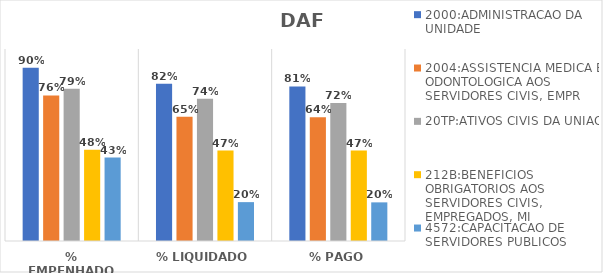
| Category | 2000:ADMINISTRACAO DA UNIDADE | 2004:ASSISTENCIA MEDICA E ODONTOLOGICA AOS SERVIDORES CIVIS, EMPR | 20TP:ATIVOS CIVIS DA UNIAO | 212B:BENEFICIOS OBRIGATORIOS AOS SERVIDORES CIVIS, EMPREGADOS, MI | 4572:CAPACITACAO DE SERVIDORES PUBLICOS FEDERAIS EM PROCESSO DE Q |
|---|---|---|---|---|---|
| % EMPENHADO | 0.902 | 0.758 | 0.793 | 0.476 | 0.435 |
| % LIQUIDADO | 0.818 | 0.647 | 0.741 | 0.471 | 0.202 |
| % PAGO | 0.805 | 0.645 | 0.719 | 0.471 | 0.201 |